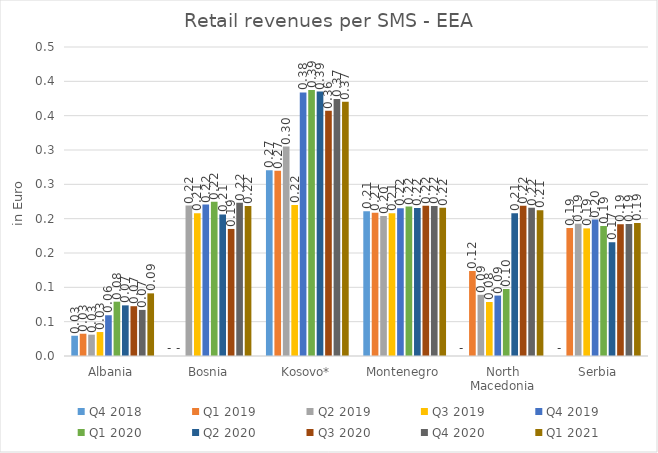
| Category | Q4 2018 | Q1 2019 | Q2 2019 | Q3 2019 | Q4 2019 | Q1 2020 | Q2 2020 | Q3 2020 | Q4 2020 | Q1 2021 |
|---|---|---|---|---|---|---|---|---|---|---|
| Albania | 0.03 | 0.032 | 0.031 | 0.035 | 0.059 | 0.079 | 0.074 | 0.073 | 0.067 | 0.091 |
| Bosnia | 0 | 0 | 0.219 | 0.208 | 0.22 | 0.225 | 0.206 | 0.185 | 0.223 | 0.218 |
| Kosovo* | 0.271 | 0.27 | 0.305 | 0.22 | 0.384 | 0.387 | 0.385 | 0.357 | 0.374 | 0.37 |
| Montenegro | 0.211 | 0.208 | 0.204 | 0.208 | 0.215 | 0.218 | 0.216 | 0.219 | 0.219 | 0.216 |
| North Macedonia | 0 | 0.124 | 0.089 | 0.079 | 0.088 | 0.098 | 0.208 | 0.219 | 0.216 | 0.212 |
| Serbia | 0 | 0.186 | 0.193 | 0.186 | 0.199 | 0.189 | 0.166 | 0.192 | 0.192 | 0.194 |